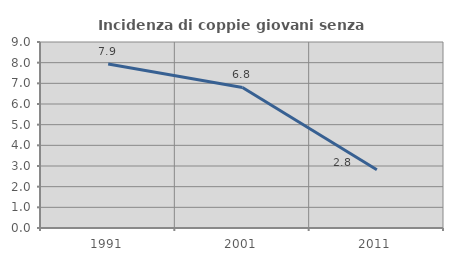
| Category | Incidenza di coppie giovani senza figli |
|---|---|
| 1991.0 | 7.939 |
| 2001.0 | 6.799 |
| 2011.0 | 2.821 |